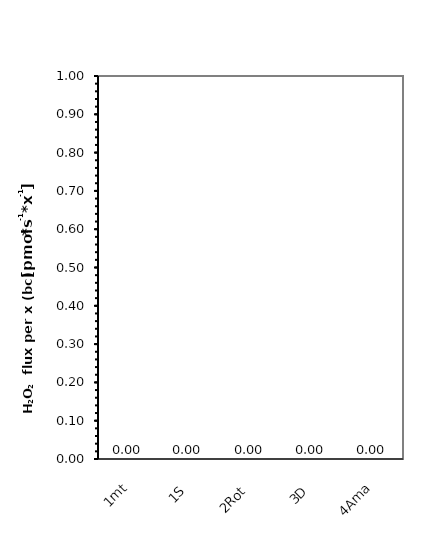
| Category | H2O2 flux per x (bc) |
|---|---|
| 1mt | 0 |
| 1S | 0 |
| 2Rot | 0 |
| 3D | 0 |
| 4Ama | 0 |